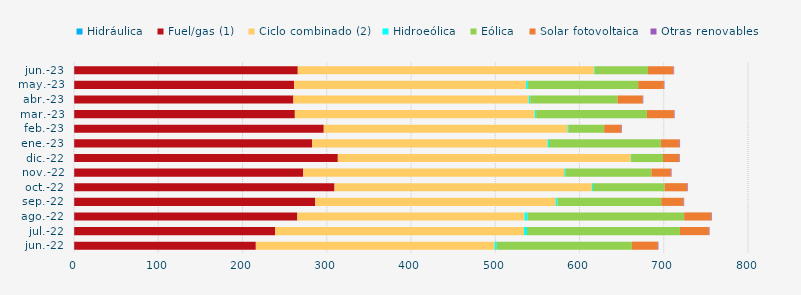
| Category | Hidráulica | Fuel/gas (1) | Ciclo combinado (2) | Hidroeólica | Eólica | Solar fotovoltaica | Otras renovables |
|---|---|---|---|---|---|---|---|
| jun.-22 | 0.281 | 215.547 | 283.584 | 2.45 | 160.357 | 30.752 | 0.696 |
| jul.-22 | 0.294 | 238.315 | 295.517 | 3.563 | 181.499 | 34.435 | 0.688 |
| ago.-22 | 0.293 | 264.802 | 269.791 | 3.518 | 185.783 | 32.263 | 0.715 |
| sep.-22 | 0.289 | 286.046 | 285.298 | 2.075 | 123.261 | 26.539 | 0.715 |
| oct.-22 | 0.294 | 308.951 | 305.386 | 1.35 | 85.079 | 26.753 | 0.731 |
| nov.-22 | 0.277 | 271.883 | 309.743 | 1.169 | 102.221 | 23.169 | 0.765 |
| dic.-22 | 0.289 | 312.877 | 347.662 | 0.367 | 37.913 | 19.007 | 0.785 |
| ene.-23 | 0.275 | 282.444 | 279.419 | 1.65 | 132.728 | 22.065 | 0.784 |
| feb.-23 | 0.254 | 296.204 | 289.333 | 0.829 | 42.685 | 20.223 | 0.711 |
| mar.-23 | 0.29 | 261.841 | 284.831 | 1.572 | 131.438 | 32.126 | 0.738 |
| abr.-23 | 0.276 | 260.1 | 279.544 | 1.573 | 103.685 | 29.89 | 0.631 |
| may.-23 | 0.298 | 261.008 | 275.341 | 2.067 | 130.95 | 30.463 | 0.651 |
| jun.-23 | 0.284 | 265.329 | 351.459 | 0.809 | 63.396 | 30.367 | 0.665 |